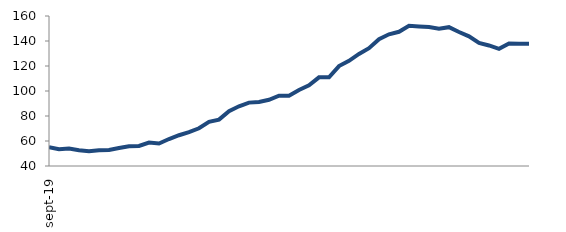
| Category | Series 0 |
|---|---|
| 2019-09-01 | 55.107 |
| 2019-10-01 | 53.41 |
| 2019-11-01 | 53.924 |
| 2019-12-01 | 52.607 |
| 2020-01-01 | 51.869 |
| 2020-02-01 | 52.619 |
| 2020-03-01 | 52.83 |
| 2020-04-01 | 54.43 |
| 2020-05-01 | 55.851 |
| 2020-06-01 | 56.062 |
| 2020-07-01 | 58.766 |
| 2020-08-01 | 57.967 |
| 2020-09-01 | 61.563 |
| 2020-10-01 | 64.611 |
| 2020-11-01 | 67.053 |
| 2020-12-01 | 70.207 |
| 2021-01-01 | 75.283 |
| 2021-02-01 | 77.125 |
| 2021-03-01 | 83.917 |
| 2021-04-01 | 87.772 |
| 2021-05-01 | 90.698 |
| 2021-06-01 | 91.254 |
| 2021-07-01 | 92.957 |
| 2021-08-01 | 96.281 |
| 2021-09-01 | 96.228 |
| 2021-10-01 | 100.807 |
| 2021-11-01 | 104.506 |
| 2021-12-01 | 110.93 |
| 2022-01-01 | 110.966 |
| 2022-02-01 | 119.928 |
| 2022-03-01 | 124.133 |
| 2022-04-01 | 129.687 |
| 2022-05-01 | 134.267 |
| 2022-06-01 | 141.471 |
| 2022-07-01 | 145.357 |
| 2022-08-01 | 147.378 |
| 2022-09-01 | 152.132 |
| 2022-10-01 | 151.659 |
| 2022-11-01 | 151.229 |
| 2022-12-01 | 149.84 |
| 2023-01-01 | 151.047 |
| 2023-02-01 | 147.233 |
| 2023-03-01 | 143.736 |
| 2023-04-01 | 138.403 |
| 2023-05-01 | 136.434 |
| 2023-06-01 | 133.747 |
| 2023-07-01 | 138.012 |
| 2023-08-01 | 137.887 |
| 2023-09-01 | 137.892 |